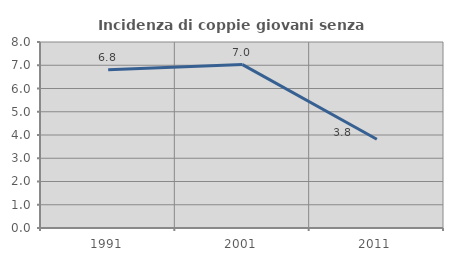
| Category | Incidenza di coppie giovani senza figli |
|---|---|
| 1991.0 | 6.804 |
| 2001.0 | 7.028 |
| 2011.0 | 3.818 |